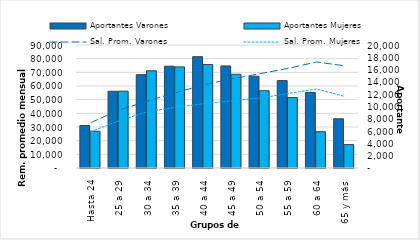
| Category | Aportantes Varones | Aportantes Mujeres |
|---|---|---|
| Hasta 24 | 6906 | 5983 |
| 25 a 29 | 12481 | 12496 |
| 30 a 34 | 15179 | 15813 |
| 35 a 39 | 16553 | 16442 |
| 40 a 44 | 18100 | 16833 |
| 45 a 49 | 16600 | 15240 |
| 50 a 54 | 14931 | 12563 |
| 55 a 59 | 14209 | 11470 |
| 60 a 64 | 12277 | 5909 |
| 65 y más | 8006 | 3808 |